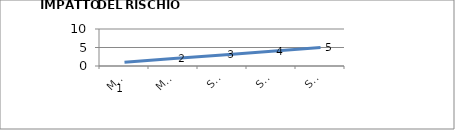
| Category | Series 0 |
|---|---|
| MARGINALE | 1 |
| MINORE | 2 |
| SOGLIA | 3 |
| SERIO | 4 |
| SUPERIORE | 5 |